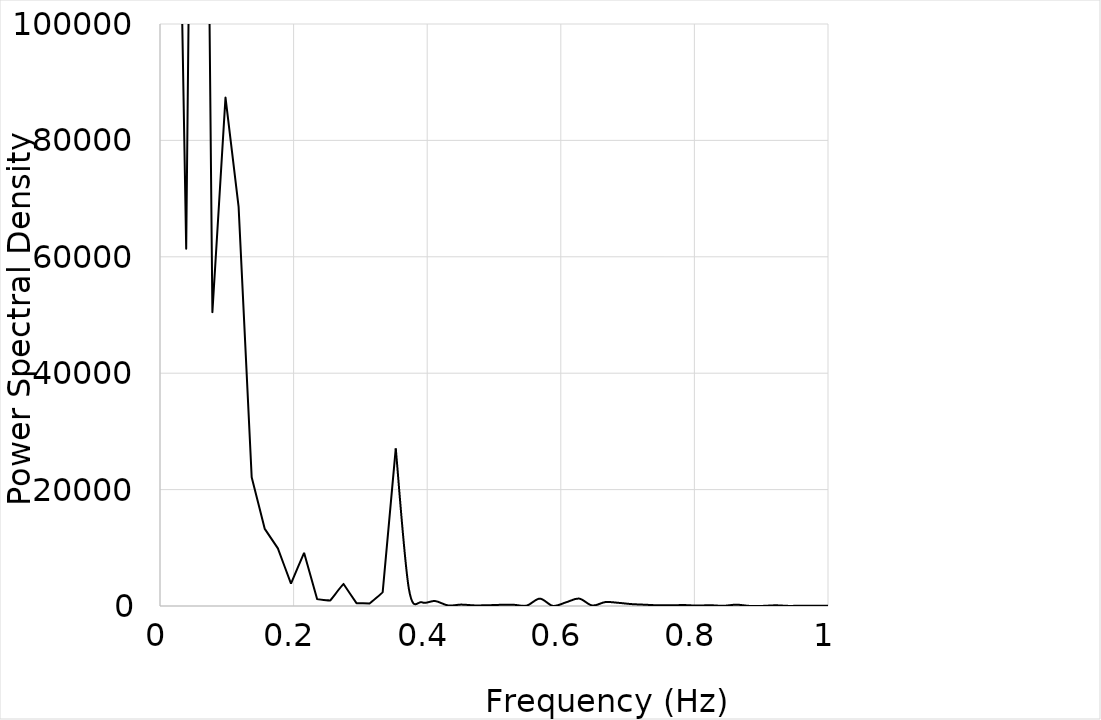
| Category | Propellant rate |
|---|---|
| 0.0 | 21100644.183 |
| 0.0196078431372549 | 205096.893 |
| 0.0392156862745098 | 61401.607 |
| 0.058823529411764705 | 280158.302 |
| 0.0784313725490196 | 50494.963 |
| 0.09803921568627451 | 87372.991 |
| 0.11764705882352941 | 68632.121 |
| 0.13725490196078433 | 22131.696 |
| 0.1568627450980392 | 13245.42 |
| 0.1764705882352941 | 9891.942 |
| 0.196078431372549 | 3854.445 |
| 0.21568627450980388 | 9139.869 |
| 0.23529411764705876 | 1167.097 |
| 0.25490196078431365 | 943.896 |
| 0.27450980392156854 | 3815.855 |
| 0.29411764705882343 | 486.592 |
| 0.3137254901960783 | 422.617 |
| 0.3333333333333332 | 2340.661 |
| 0.3529411764705881 | 27075.453 |
| 0.372549019607843 | 2969.092 |
| 0.39215686274509787 | 637.227 |
| 0.41176470588235276 | 855.821 |
| 0.43137254901960764 | 94.444 |
| 0.45098039215686253 | 242.266 |
| 0.4705882352941174 | 105.604 |
| 0.4901960784313723 | 128.996 |
| 0.5098039215686272 | 200.504 |
| 0.5294117647058821 | 209.015 |
| 0.5490196078431371 | 66.955 |
| 0.568627450980392 | 1264.781 |
| 0.588235294117647 | 17.89 |
| 0.6078431372549019 | 627.806 |
| 0.6274509803921569 | 1271.707 |
| 0.6470588235294118 | 86.006 |
| 0.6666666666666667 | 670.785 |
| 0.6862745098039217 | 546.666 |
| 0.7058823529411766 | 326.947 |
| 0.7254901960784316 | 223.016 |
| 0.7450980392156865 | 120.229 |
| 0.7647058823529415 | 115.048 |
| 0.7843137254901964 | 162.149 |
| 0.8039215686274513 | 67.946 |
| 0.8235294117647063 | 134.54 |
| 0.8431372549019612 | 29.623 |
| 0.8627450980392162 | 227.16 |
| 0.8823529411764711 | 15.058 |
| 0.9019607843137261 | 15.753 |
| 0.921568627450981 | 117.16 |
| 0.941176470588236 | 16.538 |
| 0.9607843137254909 | 49.896 |
| 0.9803921568627458 | 48.677 |
| 1.0000000000000007 | 46.479 |
| 1.0196078431372555 | 45.559 |
| 1.0392156862745103 | 43.344 |
| 1.0588235294117652 | 62.861 |
| 1.07843137254902 | 65.094 |
| 1.0980392156862748 | 34.849 |
| 1.1176470588235297 | 176.447 |
| 1.1372549019607845 | 70.24 |
| 1.1568627450980393 | 59.825 |
| 1.1764705882352942 | 32.494 |
| 1.196078431372549 | 63.306 |
| 1.2156862745098038 | 2.051 |
| 1.2352941176470587 | 67.386 |
| 1.2549019607843135 | 39.118 |
| 1.2745098039215683 | 61.641 |
| 1.2941176470588232 | 264.366 |
| 1.313725490196078 | 276.525 |
| 1.3333333333333328 | 109.149 |
| 1.3529411764705876 | 43.975 |
| 1.3725490196078425 | 78.621 |
| 1.3921568627450973 | 42.15 |
| 1.4117647058823521 | 183.681 |
| 1.431372549019607 | 26.887 |
| 1.4509803921568618 | 46.099 |
| 1.4705882352941166 | 30.251 |
| 1.4901960784313715 | 46.764 |
| 1.5098039215686263 | 12.216 |
| 1.5294117647058811 | 0.8 |
| 1.549019607843136 | 68.755 |
| 1.5686274509803908 | 114.529 |
| 1.5882352941176456 | 148.278 |
| 1.6078431372549005 | 104.354 |
| 1.6274509803921553 | 115.717 |
| 1.6470588235294101 | 136.417 |
| 1.666666666666665 | 3.333 |
| 1.6862745098039198 | 89.05 |
| 1.7058823529411746 | 34.376 |
| 1.7254901960784295 | 19.454 |
| 1.7450980392156843 | 32.156 |
| 1.7647058823529391 | 31.578 |
| 1.784313725490194 | 24.673 |
| 1.8039215686274488 | 65.776 |
| 1.8235294117647036 | 15.319 |
| 1.8431372549019585 | 47.493 |
| 1.8627450980392133 | 58.869 |
| 1.8823529411764681 | 25.369 |
| 1.901960784313723 | 41.784 |
| 1.9215686274509778 | 5.877 |
| 1.9411764705882326 | 24.674 |
| 1.9607843137254874 | 9.584 |
| 1.9803921568627423 | 13.75 |
| 1.9999999999999971 | 12.362 |
| 2.019607843137252 | 13.487 |
| 2.039215686274507 | 15.396 |
| 2.058823529411762 | 9.631 |
| 2.0784313725490167 | 36.586 |
| 2.0980392156862715 | 11.698 |
| 2.1176470588235263 | 33.511 |
| 2.137254901960781 | 59.557 |
| 2.156862745098036 | 3.025 |
| 2.176470588235291 | 9.957 |
| 2.1960784313725457 | 23.017 |
| 2.2156862745098005 | 8.611 |
| 2.2352941176470553 | 15.342 |
| 2.25490196078431 | 8.92 |
| 2.274509803921565 | 9.276 |
| 2.29411764705882 | 32.237 |
| 2.3137254901960747 | 14.58 |
| 2.3333333333333295 | 17.585 |
| 2.3529411764705843 | 20.889 |
| 2.372549019607839 | 37.789 |
| 2.392156862745094 | 2.997 |
| 2.411764705882349 | 96.714 |
| 2.4313725490196036 | 37.161 |
| 2.4509803921568585 | 49.842 |
| 2.4705882352941133 | 36.167 |
| 2.490196078431368 | 7.814 |
| 2.509803921568623 | 8.666 |
| 2.529411764705878 | 7.814 |
| 2.5490196078431326 | 36.167 |
| 2.5686274509803875 | 49.842 |
| 2.5882352941176423 | 37.161 |
| 2.607843137254897 | 96.714 |
| 2.627450980392152 | 2.997 |
| 2.647058823529407 | 37.789 |
| 2.6666666666666616 | 20.889 |
| 2.6862745098039165 | 17.585 |
| 2.7058823529411713 | 14.58 |
| 2.725490196078426 | 32.237 |
| 2.745098039215681 | 9.276 |
| 2.764705882352936 | 8.92 |
| 2.7843137254901906 | 15.342 |
| 2.8039215686274455 | 8.611 |
| 2.8235294117647003 | 23.017 |
| 2.843137254901955 | 9.957 |
| 2.86274509803921 | 3.025 |
| 2.882352941176465 | 59.557 |
| 2.9019607843137196 | 33.511 |
| 2.9215686274509745 | 11.698 |
| 2.9411764705882293 | 36.586 |
| 2.960784313725484 | 9.631 |
| 2.980392156862739 | 15.396 |
| 2.999999999999994 | 13.487 |
| 3.0196078431372486 | 12.362 |
| 3.0392156862745034 | 13.75 |
| 3.0588235294117583 | 9.584 |
| 3.078431372549013 | 24.674 |
| 3.098039215686268 | 5.877 |
| 3.1176470588235228 | 41.784 |
| 3.1372549019607776 | 25.369 |
| 3.1568627450980324 | 58.869 |
| 3.1764705882352873 | 47.493 |
| 3.196078431372542 | 15.319 |
| 3.215686274509797 | 65.776 |
| 3.2352941176470518 | 24.673 |
| 3.2549019607843066 | 31.578 |
| 3.2745098039215614 | 32.156 |
| 3.2941176470588163 | 19.454 |
| 3.313725490196071 | 34.376 |
| 3.333333333333326 | 89.05 |
| 3.3529411764705808 | 3.333 |
| 3.3725490196078356 | 136.417 |
| 3.3921568627450904 | 115.717 |
| 3.4117647058823453 | 104.354 |
| 3.4313725490196 | 148.278 |
| 3.450980392156855 | 114.529 |
| 3.4705882352941098 | 68.755 |
| 3.4901960784313646 | 0.8 |
| 3.5098039215686194 | 12.216 |
| 3.5294117647058743 | 46.764 |
| 3.549019607843129 | 30.251 |
| 3.568627450980384 | 46.099 |
| 3.5882352941176388 | 26.887 |
| 3.6078431372548936 | 183.681 |
| 3.6274509803921484 | 42.15 |
| 3.6470588235294032 | 78.621 |
| 3.666666666666658 | 43.975 |
| 3.686274509803913 | 109.149 |
| 3.7058823529411677 | 276.525 |
| 3.7254901960784226 | 264.366 |
| 3.7450980392156774 | 61.641 |
| 3.7647058823529322 | 39.118 |
| 3.784313725490187 | 67.386 |
| 3.803921568627442 | 2.051 |
| 3.8235294117646967 | 63.306 |
| 3.8431372549019516 | 32.494 |
| 3.8627450980392064 | 59.825 |
| 3.8823529411764612 | 70.24 |
| 3.901960784313716 | 176.447 |
| 3.921568627450971 | 34.849 |
| 3.9411764705882257 | 65.094 |
| 3.9607843137254806 | 62.861 |
| 3.9803921568627354 | 43.344 |
| 3.9999999999999902 | 45.559 |
| 4.019607843137245 | 46.479 |
| 4.0392156862745 | 48.677 |
| 4.058823529411755 | 49.896 |
| 4.07843137254901 | 16.538 |
| 4.098039215686264 | 117.16 |
| 4.117647058823519 | 15.753 |
| 4.137254901960774 | 15.058 |
| 4.156862745098029 | 227.16 |
| 4.176470588235284 | 29.623 |
| 4.1960784313725386 | 134.54 |
| 4.215686274509793 | 67.946 |
| 4.235294117647048 | 162.149 |
| 4.254901960784303 | 115.048 |
| 4.274509803921558 | 120.229 |
| 4.294117647058813 | 223.016 |
| 4.3137254901960675 | 326.947 |
| 4.333333333333322 | 546.666 |
| 4.352941176470577 | 670.785 |
| 4.372549019607832 | 86.006 |
| 4.392156862745087 | 1271.707 |
| 4.411764705882342 | 627.806 |
| 4.4313725490195965 | 17.89 |
| 4.450980392156851 | 1264.781 |
| 4.470588235294106 | 66.955 |
| 4.490196078431361 | 209.015 |
| 4.509803921568616 | 200.504 |
| 4.529411764705871 | 128.996 |
| 4.5490196078431255 | 105.604 |
| 4.56862745098038 | 242.266 |
| 4.588235294117635 | 94.444 |
| 4.60784313725489 | 855.821 |
| 4.627450980392145 | 637.227 |
| 4.6470588235294 | 2969.092 |
| 4.6666666666666545 | 27075.453 |
| 4.686274509803909 | 2340.661 |
| 4.705882352941164 | 422.617 |
| 4.725490196078419 | 486.592 |
| 4.745098039215674 | 3815.855 |
| 4.764705882352929 | 943.896 |
| 4.7843137254901835 | 1167.097 |
| 4.803921568627438 | 9139.869 |
| 4.823529411764693 | 3854.445 |
| 4.843137254901948 | 9891.942 |
| 4.862745098039203 | 13245.42 |
| 4.882352941176458 | 22131.696 |
| 4.9019607843137125 | 68632.121 |
| 4.921568627450967 | 87372.991 |
| 4.941176470588222 | 50494.963 |
| 4.960784313725477 | 280158.302 |
| 4.980392156862732 | 61401.607 |
| 4.999999999999987 | 205096.893 |